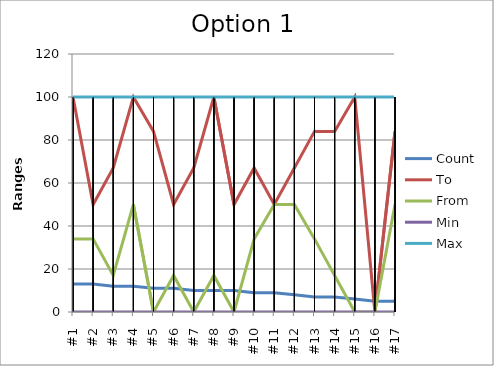
| Category | Count | To | From | Min | Max |
|---|---|---|---|---|---|
| #1 | 13 | 100 | 34 | 0 | 100 |
| #2 | 13 | 50 | 34 | 0 | 100 |
| #3 | 12 | 67 | 17 | 0 | 100 |
| #4 | 12 | 100 | 50 | 0 | 100 |
| #5 | 11 | 84 | 0 | 0 | 100 |
| #6 | 11 | 50 | 17 | 0 | 100 |
| #7 | 10 | 67 | 0 | 0 | 100 |
| #8 | 10 | 100 | 17 | 0 | 100 |
| #9 | 10 | 50 | 0 | 0 | 100 |
| #10 | 9 | 67 | 34 | 0 | 100 |
| #11 | 9 | 50 | 50 | 0 | 100 |
| #12 | 8 | 67 | 50 | 0 | 100 |
| #13 | 7 | 84 | 34 | 0 | 100 |
| #14 | 7 | 84 | 17 | 0 | 100 |
| #15 | 6 | 100 | 0 | 0 | 100 |
| #16 | 5 | 0 | 0 | 0 | 100 |
| #17 | 5 | 84 | 50 | 0 | 100 |